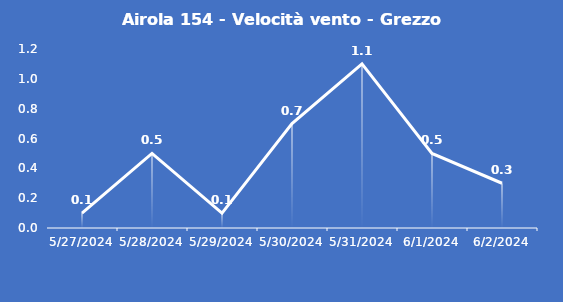
| Category | Airola 154 - Velocità vento - Grezzo (m/s) |
|---|---|
| 5/27/24 | 0.1 |
| 5/28/24 | 0.5 |
| 5/29/24 | 0.1 |
| 5/30/24 | 0.7 |
| 5/31/24 | 1.1 |
| 6/1/24 | 0.5 |
| 6/2/24 | 0.3 |